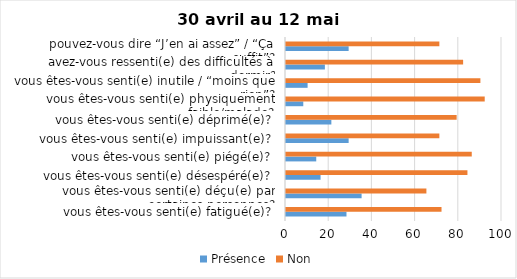
| Category | Présence | Non |
|---|---|---|
| vous êtes-vous senti(e) fatigué(e)? | 28 | 72 |
| vous êtes-vous senti(e) déçu(e) par certaines personnes? | 35 | 65 |
| vous êtes-vous senti(e) désespéré(e)? | 16 | 84 |
| vous êtes-vous senti(e) piégé(e)? | 14 | 86 |
| vous êtes-vous senti(e) impuissant(e)? | 29 | 71 |
| vous êtes-vous senti(e) déprimé(e)? | 21 | 79 |
| vous êtes-vous senti(e) physiquement faible/malade? | 8 | 92 |
| vous êtes-vous senti(e) inutile / “moins que rien”? | 10 | 90 |
| avez-vous ressenti(e) des difficultés à dormir? | 18 | 82 |
| pouvez-vous dire “J’en ai assez” / “Ça suffit”? | 29 | 71 |